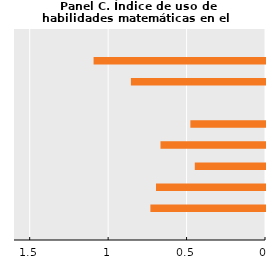
| Category | Series 0 |
|---|---|
| 0 | 0 |
| 1 | 0.73 |
| 2 | 0.695 |
| 3 | 0.448 |
| 4 | 0.666 |
| 5 | 0.476 |
| 6 | 0 |
| 7 | 0.855 |
| 8 | 1.093 |
| 9 | 0 |